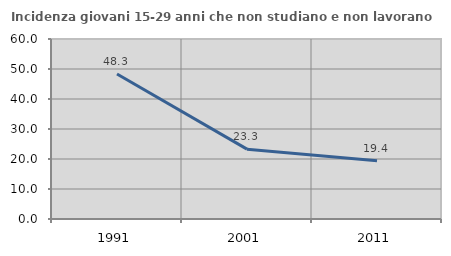
| Category | Incidenza giovani 15-29 anni che non studiano e non lavorano  |
|---|---|
| 1991.0 | 48.315 |
| 2001.0 | 23.28 |
| 2011.0 | 19.444 |